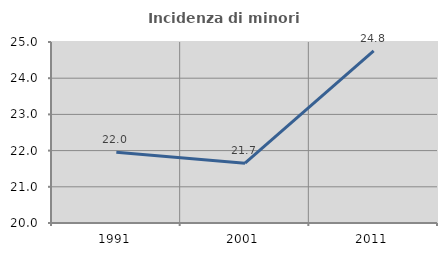
| Category | Incidenza di minori stranieri |
|---|---|
| 1991.0 | 21.951 |
| 2001.0 | 21.654 |
| 2011.0 | 24.752 |